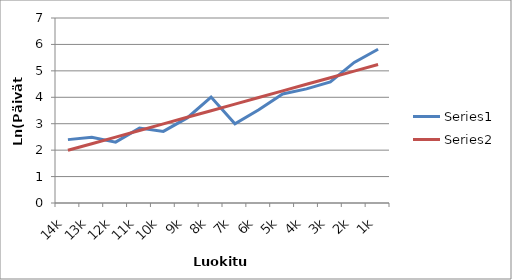
| Category | Series 0 | Series 1 |
|---|---|---|
| 14k | 2.398 | 1.995 |
| 13k | 2.485 | 2.245 |
| 12k | 2.303 | 2.494 |
| 11k | 2.833 | 2.744 |
| 10k | 2.708 | 2.993 |
| 9k | 3.219 | 3.243 |
| 8k | 4.007 | 3.492 |
| 7k | 2.996 | 3.742 |
| 6k | 3.526 | 3.991 |
| 5k | 4.127 | 4.241 |
| 4k | 4.317 | 4.491 |
| 3k | 4.585 | 4.74 |
| 2k | 5.318 | 4.99 |
| 1k | 5.817 | 5.239 |